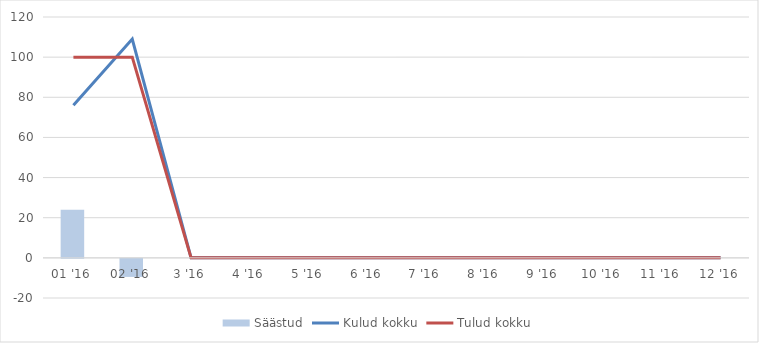
| Category | Säästud |
|---|---|
| 01 '16 | 24 |
| 02 '16 | -9 |
| 3 '16 | 0 |
| 4 '16 | 0 |
| 5 '16 | 0 |
| 6 '16 | 0 |
| 7 '16 | 0 |
| 8 '16 | 0 |
| 9 '16 | 0 |
| 10 '16 | 0 |
| 11 '16 | 0 |
| 12 '16 | 0 |